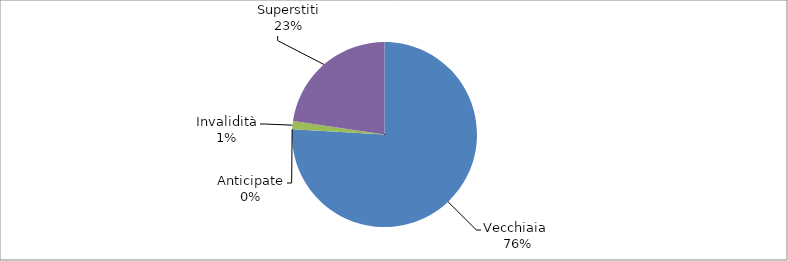
| Category | Series 0 |
|---|---|
| Vecchiaia  | 15894 |
| Anticipate | 0 |
| Invalidità | 296 |
| Superstiti | 4749 |